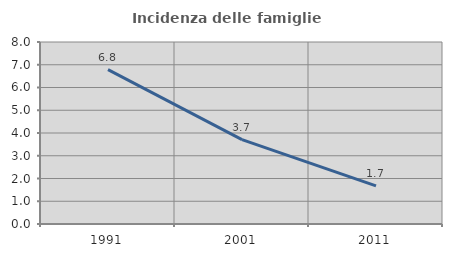
| Category | Incidenza delle famiglie numerose |
|---|---|
| 1991.0 | 6.786 |
| 2001.0 | 3.706 |
| 2011.0 | 1.677 |